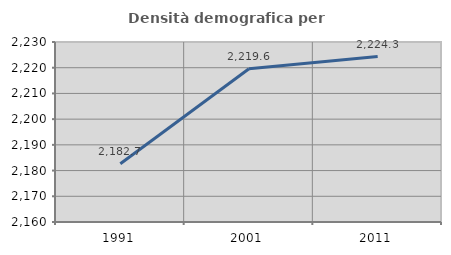
| Category | Densità demografica |
|---|---|
| 1991.0 | 2182.653 |
| 2001.0 | 2219.584 |
| 2011.0 | 2224.333 |